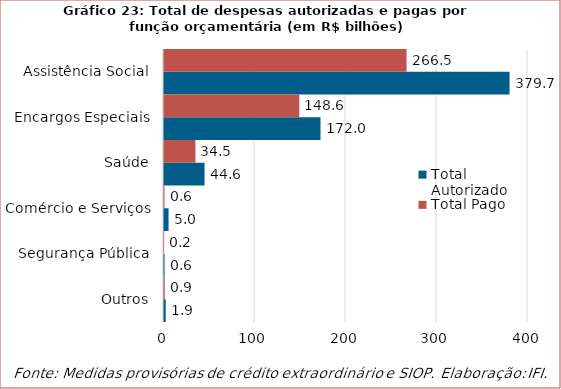
| Category | Total Autorizado | Total Pago |
|---|---|---|
| Outros | 1.894 | 0.853 |
|  Segurança Pública | 0.59 | 0.167 |
|  Comércio e Serviços | 5 | 0.574 |
|  Saúde | 44.557 | 34.496 |
|  Encargos Especiais | 171.989 | 148.637 |
|  Assistência Social | 379.721 | 266.532 |